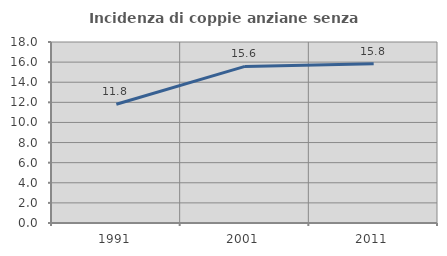
| Category | Incidenza di coppie anziane senza figli  |
|---|---|
| 1991.0 | 11.809 |
| 2001.0 | 15.572 |
| 2011.0 | 15.827 |